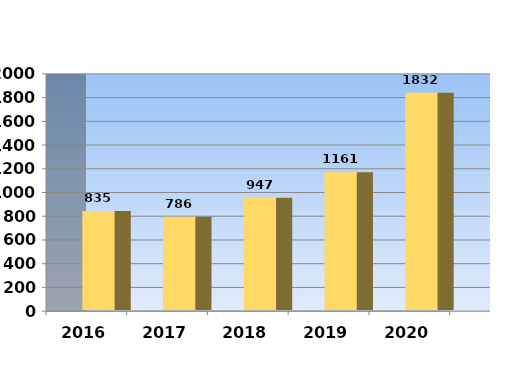
| Category | Series 0 |
|---|---|
| 2016.0 | 835 |
| 2017.0 | 786 |
| 2018.0 | 947 |
| 2019.0 | 1161 |
| 2020.0 | 1832 |